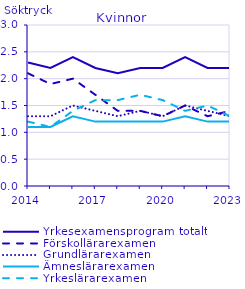
| Category | Yrkesexamensprogram totalt | Förskollärarexamen                                 | Grundlärarexamen                                   | Ämneslärarexamen                                   | Yrkeslärarexamen                                   |
|---|---|---|---|---|---|
| 2014.0 | 2.3 | 2.1 | 1.3 | 1.1 | 1.2 |
| 2015.0 | 2.2 | 1.9 | 1.3 | 1.1 | 1.1 |
| 2016.0 | 2.4 | 2 | 1.5 | 1.3 | 1.4 |
| 2017.0 | 2.2 | 1.7 | 1.4 | 1.2 | 1.6 |
| 2018.0 | 2.1 | 1.4 | 1.3 | 1.2 | 1.6 |
| 2019.0 | 2.2 | 1.4 | 1.4 | 1.2 | 1.7 |
| 2020.0 | 2.2 | 1.3 | 1.3 | 1.2 | 1.6 |
| 2021.0 | 2.4 | 1.5 | 1.5 | 1.3 | 1.4 |
| 2022.0 | 2.2 | 1.3 | 1.4 | 1.2 | 1.5 |
| 2023.0 | 2.2 | 1.4 | 1.3 | 1.2 | 1.3 |